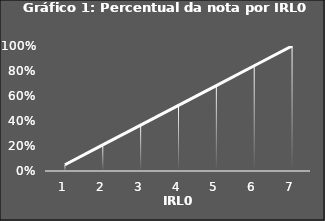
| Category | Series 1 |
|---|---|
| 0 | 0.05 |
| 1 | 0.208 |
| 2 | 0.367 |
| 3 | 0.525 |
| 4 | 0.683 |
| 5 | 0.842 |
| 6 | 1 |